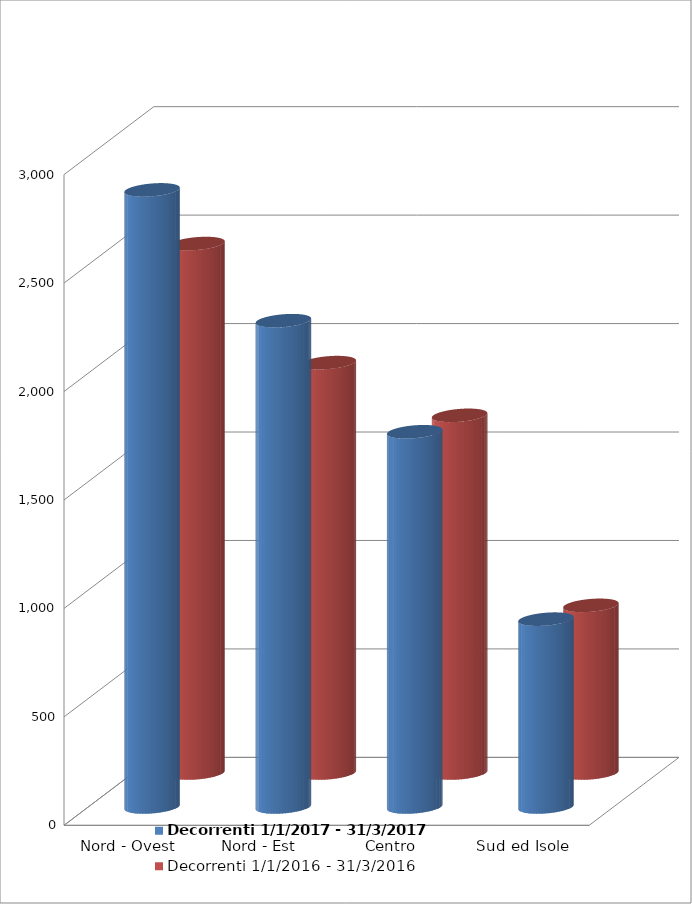
| Category | Decorrenti 1/1/2017 - 31/3/2017 | Decorrenti 1/1/2016 - 31/3/2016 |
|---|---|---|
| Nord - Ovest | 2845 | 2441 |
| Nord - Est | 2242 | 1892 |
| Centro | 1730 | 1649 |
| Sud ed Isole | 866 | 773 |